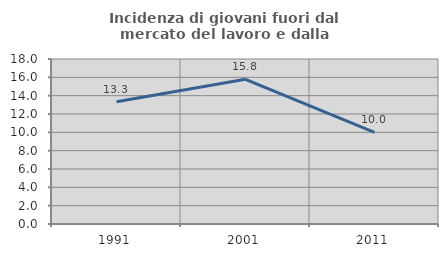
| Category | Incidenza di giovani fuori dal mercato del lavoro e dalla formazione  |
|---|---|
| 1991.0 | 13.333 |
| 2001.0 | 15.789 |
| 2011.0 | 10 |